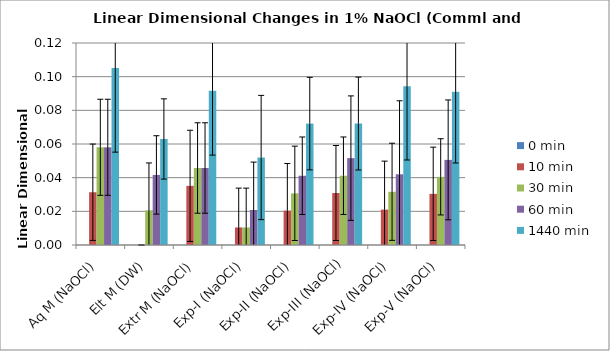
| Category | 0 min | 10 min | 30 min | 60 min | 1440 min |
|---|---|---|---|---|---|
| Aq M (NaOCl) | 0 | 0.031 | 0.058 | 0.058 | 0.105 |
| Elt M (DW) | 0 | 0 | 0.021 | 0.042 | 0.063 |
| Extr M (NaOCl) | 0 | 0.035 | 0.046 | 0.046 | 0.092 |
| Exp-I (NaOCl) | 0 | 0.01 | 0.01 | 0.021 | 0.052 |
| Exp-II (NaOCl) | 0 | 0.02 | 0.031 | 0.041 | 0.072 |
| Exp-III (NaOCl) | 0 | 0.031 | 0.041 | 0.052 | 0.072 |
| Exp-IV (NaOCl) | 0 | 0.021 | 0.032 | 0.042 | 0.094 |
| Exp-V (NaOCl) | 0 | 0.03 | 0.04 | 0.051 | 0.091 |